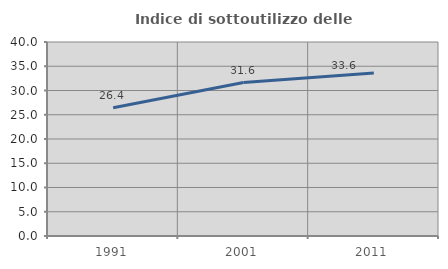
| Category | Indice di sottoutilizzo delle abitazioni  |
|---|---|
| 1991.0 | 26.435 |
| 2001.0 | 31.634 |
| 2011.0 | 33.627 |